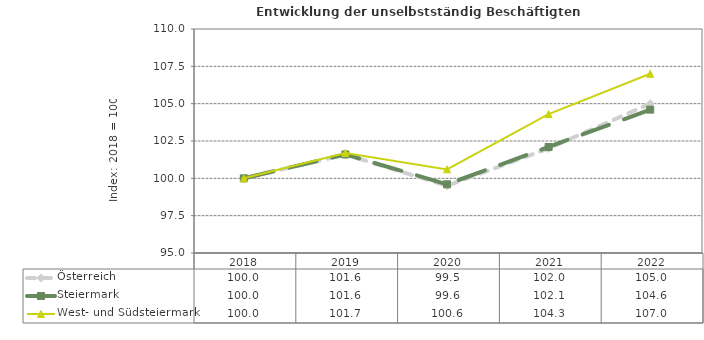
| Category | Österreich | Steiermark | West- und Südsteiermark |
|---|---|---|---|
| 2022.0 | 105 | 104.6 | 107 |
| 2021.0 | 102 | 102.1 | 104.3 |
| 2020.0 | 99.5 | 99.6 | 100.6 |
| 2019.0 | 101.6 | 101.6 | 101.7 |
| 2018.0 | 100 | 100 | 100 |